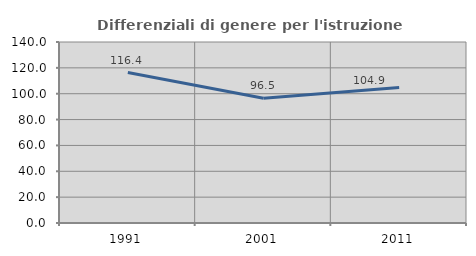
| Category | Differenziali di genere per l'istruzione superiore |
|---|---|
| 1991.0 | 116.378 |
| 2001.0 | 96.545 |
| 2011.0 | 104.889 |